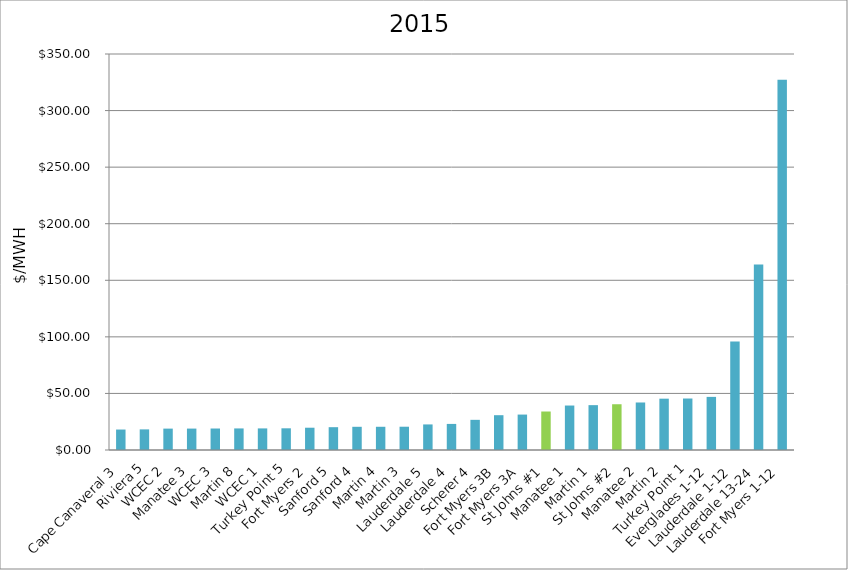
| Category | $/MWH |
|---|---|
| Cape Canaveral 3 | 18.086 |
| Riviera 5 | 18.218 |
| WCEC 2 | 18.903 |
| Manatee 3 | 18.927 |
| WCEC 3 | 18.992 |
| Martin 8 | 19.066 |
| WCEC 1 | 19.087 |
| Turkey Point 5 | 19.177 |
| Fort Myers 2 | 19.695 |
| Sanford 5 | 20.168 |
| Sanford 4 | 20.507 |
| Martin 4 | 20.525 |
| Martin 3 | 20.577 |
| Lauderdale 5 | 22.603 |
| Lauderdale 4 | 23.049 |
| Scherer 4 | 26.66 |
| Fort Myers 3B | 30.765 |
| Fort Myers 3A | 31.314 |
| St Johns #1 | 34.021 |
| Manatee 1 | 39.306 |
| Martin 1 | 39.645 |
| St Johns #2 | 40.444 |
| Manatee 2 | 41.992 |
| Martin 2 | 45.366 |
| Turkey Point 1 | 45.509 |
| Everglades 1-12 | 46.95 |
| Lauderdale 1-12 | 95.826 |
| Lauderdale 13-24 | 163.912 |
| Fort Myers 1-12 | 327.305 |